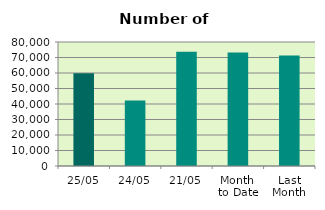
| Category | Series 0 |
|---|---|
| 25/05 | 59830 |
| 24/05 | 42206 |
| 21/05 | 73790 |
| Month 
to Date | 73272.25 |
| Last
Month | 71251.4 |